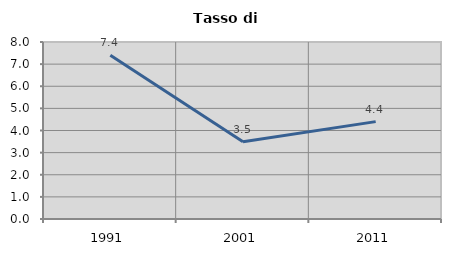
| Category | Tasso di disoccupazione   |
|---|---|
| 1991.0 | 7.4 |
| 2001.0 | 3.488 |
| 2011.0 | 4.401 |